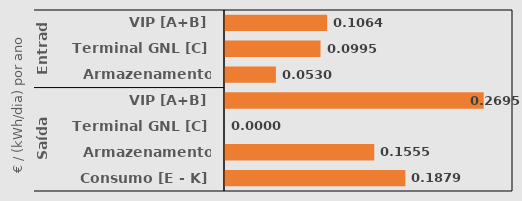
| Category | Series 0 |
|---|---|
| 0 | 0.106 |
| 1 | 0.099 |
| 2 | 0.053 |
| 3 | 0.27 |
| 4 | 0 |
| 5 | 0.155 |
| 6 | 0.188 |